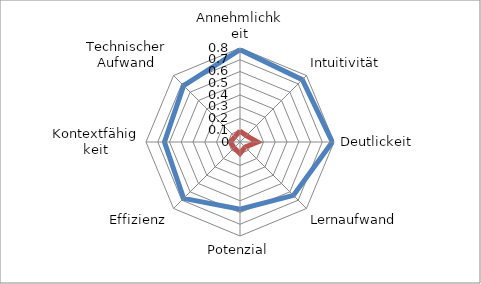
| Category | Series 0 | Series 1 |
|---|---|---|
| Annehmlichkeit | 0.786 | 0.094 |
| Intuitivität | 0.75 | 0.076 |
| Deutlickeit | 0.786 | 0.15 |
| Lernaufwand | 0.643 | 0.061 |
| Potenzial | 0.571 | 0.098 |
| Effizienz | 0.679 | 0.07 |
| Kontextfähigkeit | 0.643 | 0.081 |
| Technischer Aufwand | 0.679 | 0.063 |